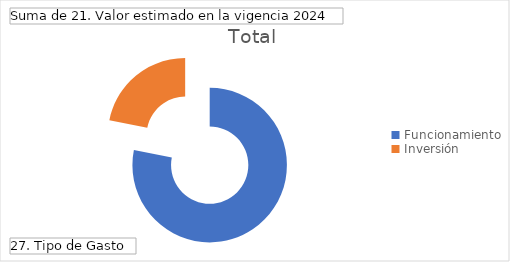
| Category | Total |
|---|---|
| Funcionamiento | 113932253086 |
| Inversión | 31930083681 |